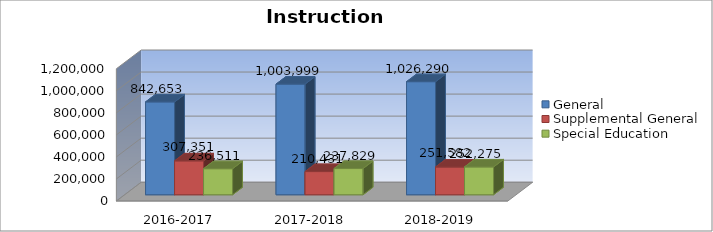
| Category | General | Supplemental General | Special Education |
|---|---|---|---|
| 2016-2017 | 842653 | 307351 | 236511 |
| 2017-2018 | 1003999 | 210431 | 237829 |
| 2018-2019 | 1026290 | 251582 | 252275 |